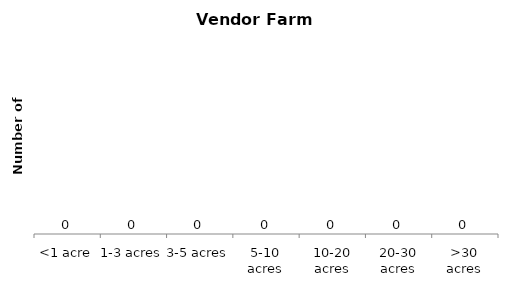
| Category | Series 0 |
|---|---|
| <1 acre | 0 |
| 1-3 acres | 0 |
| 3-5 acres | 0 |
| 5-10 acres | 0 |
| 10-20 acres | 0 |
| 20-30 acres | 0 |
| >30 acres | 0 |